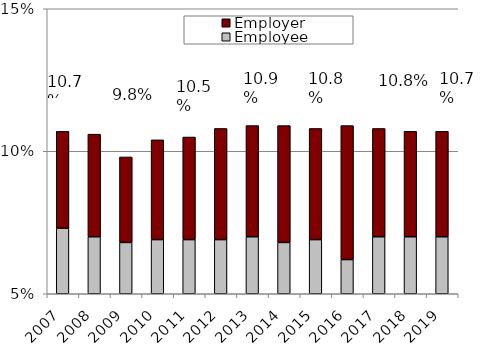
| Category | Employee | Employer  |
|---|---|---|
| 2007.0 | 0.073 | 0.034 |
| 2008.0 | 0.07 | 0.036 |
| 2009.0 | 0.068 | 0.03 |
| 2010.0 | 0.069 | 0.035 |
| 2011.0 | 0.069 | 0.036 |
| 2012.0 | 0.069 | 0.039 |
| 2013.0 | 0.07 | 0.039 |
| 2014.0 | 0.068 | 0.041 |
| 2015.0 | 0.069 | 0.039 |
| 2016.0 | 0.062 | 0.047 |
| 2017.0 | 0.07 | 0.038 |
| 2018.0 | 0.07 | 0.037 |
| 2019.0 | 0.07 | 0.037 |